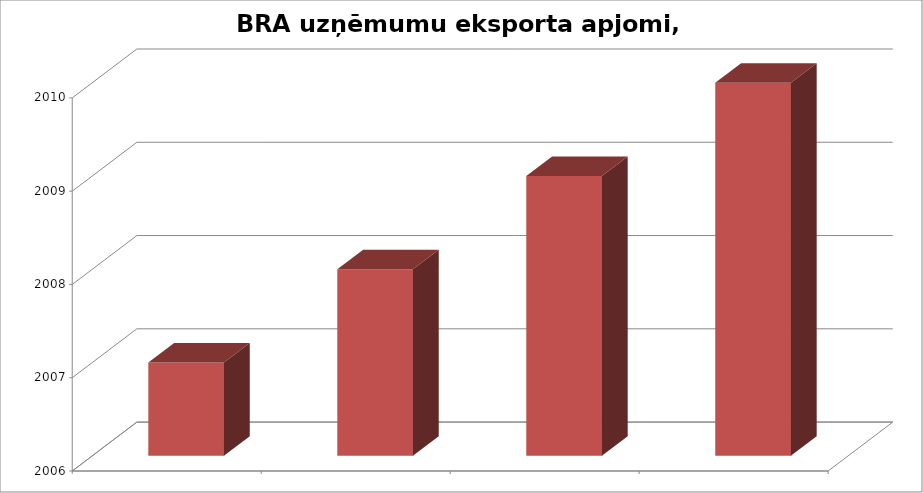
| Category | BRA uzņēmumu eksporta apjomi, milj.LVL |
|---|---|
|  | 2007 |
|  | 2008 |
|  | 2009 |
|  | 2010 |